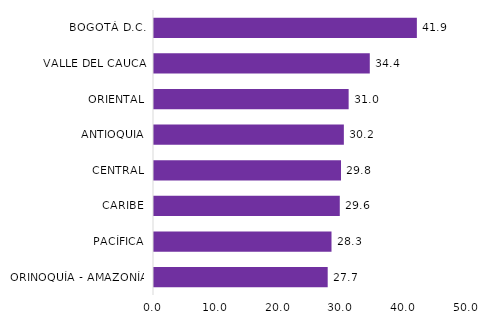
| Category | Series 0 |
|---|---|
| ORINOQUÍA - AMAZONÍA | 27.658 |
| PACÍFICA | 28.265 |
| CARIBE | 29.583 |
| CENTRAL | 29.778 |
| ANTIOQUIA | 30.232 |
| ORIENTAL | 30.995 |
| VALLE DEL CAUCA | 34.361 |
| BOGOTÁ D.C. | 41.857 |